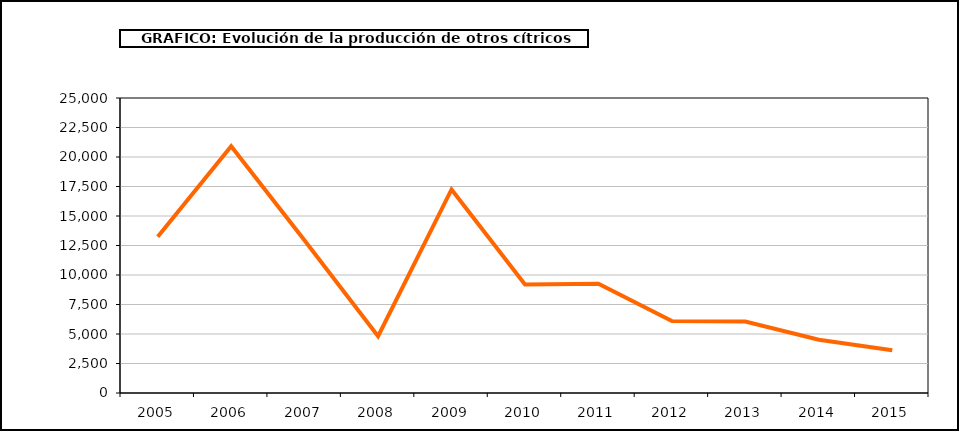
| Category | producción |
|---|---|
| 2005.0 | 13248 |
| 2006.0 | 20917 |
| 2007.0 | 12921 |
| 2008.0 | 4816 |
| 2009.0 | 17251 |
| 2010.0 | 9197 |
| 2011.0 | 9260 |
| 2012.0 | 6091 |
| 2013.0 | 6060 |
| 2014.0 | 4514 |
| 2015.0 | 3626 |